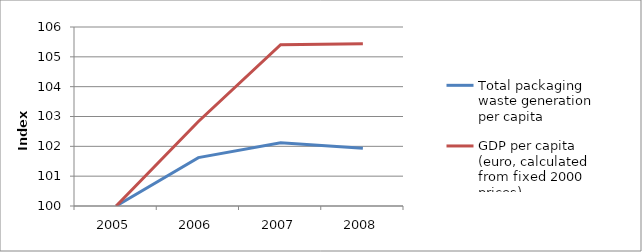
| Category | Total packaging waste generation per capita | GDP per capita (euro, calculated from fixed 2000 prices) |
|---|---|---|
| 2005.0 | 100 | 100 |
| 2006.0 | 101.621 | 102.831 |
| 2007.0 | 102.12 | 105.405 |
| 2008.0 | 101.933 | 105.436 |